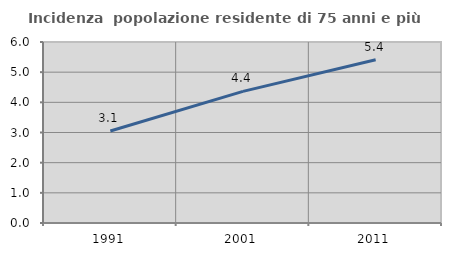
| Category | Incidenza  popolazione residente di 75 anni e più |
|---|---|
| 1991.0 | 3.051 |
| 2001.0 | 4.363 |
| 2011.0 | 5.41 |